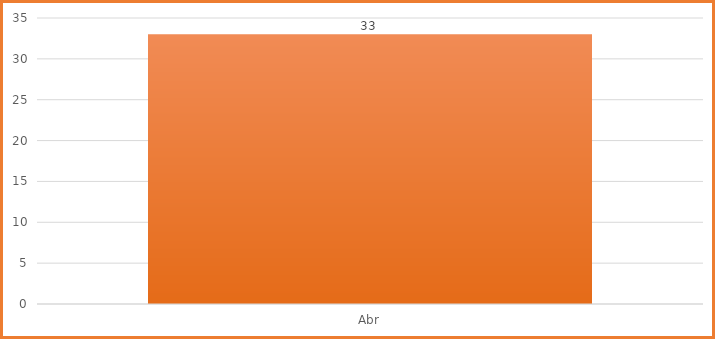
| Category | Total |
|---|---|
| Abr | 33 |